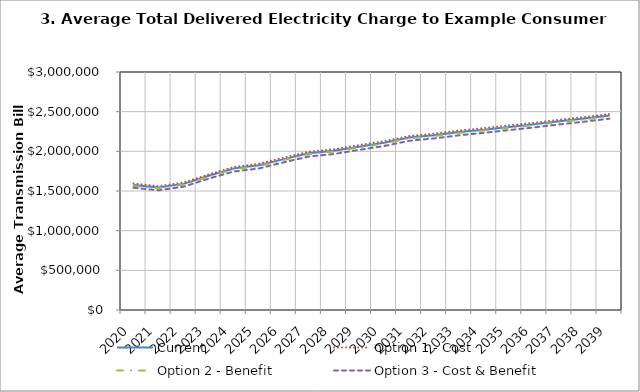
| Category | Current | Option 1 - Cost | Option 2 - Benefit | Option 3 - Cost & Benefit |
|---|---|---|---|---|
| 2020.0 | 1576570.942 | 1594802.926 | 1559712.525 | 1540516.344 |
| 2021.0 | 1543627.354 | 1561159.277 | 1534156.184 | 1508828.211 |
| 2022.0 | 1589840.329 | 1607904.331 | 1580354.442 | 1554513.592 |
| 2023.0 | 1691533.82 | 1709820.764 | 1681767.016 | 1655453.566 |
| 2024.0 | 1783643.074 | 1803200.745 | 1773388.648 | 1745425.927 |
| 2025.0 | 1823583.087 | 1843770.072 | 1812779.149 | 1783710.728 |
| 2026.0 | 1901443.691 | 1921638.161 | 1890555.935 | 1861401.876 |
| 2027.0 | 1975808.197 | 1996133.855 | 1964794.705 | 1935399.661 |
| 2028.0 | 2006430.947 | 2026818.414 | 1995433.792 | 1965996.096 |
| 2029.0 | 2059002.257 | 2079448.377 | 2047867.47 | 2018245.665 |
| 2030.0 | 2107065.629 | 2127846.462 | 2096079.606 | 2066283.387 |
| 2031.0 | 2173186.943 | 2193759.652 | 2162207.181 | 2132612.049 |
| 2032.0 | 2202893.339 | 2223295.892 | 2192006.488 | 2162658.103 |
| 2033.0 | 2242315.167 | 2262525.902 | 2231344.549 | 2202097.512 |
| 2034.0 | 2273522.196 | 2293573.616 | 2262660.073 | 2233664.232 |
| 2035.0 | 2307901.558 | 2327838.857 | 2296988.466 | 2268051.86 |
| 2036.0 | 2341063.595 | 2361007.415 | 2330332.602 | 2301560.683 |
| 2037.0 | 2378609.193 | 2398600.287 | 2367893.741 | 2339092.058 |
| 2038.0 | 2413475.001 | 2433353.672 | 2402806.442 | 2374154.191 |
| 2039.0 | 2450802.426 | 2470769.332 | 2440276.556 | 2411675.38 |